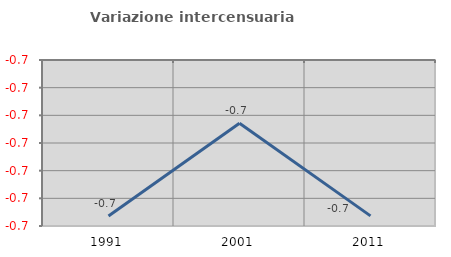
| Category | Variazione intercensuaria annua |
|---|---|
| 1991.0 | -0.723 |
| 2001.0 | -0.706 |
| 2011.0 | -0.723 |